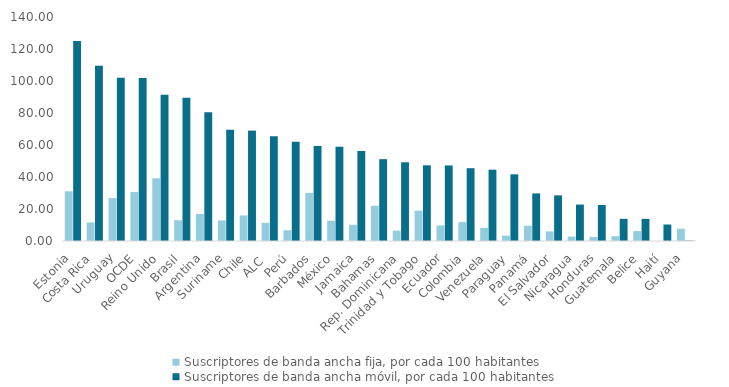
| Category | Suscriptores de banda ancha fija, por cada 100 habitantes | Suscriptores de banda ancha móvil, por cada 100 habitantes |
|---|---|---|
| Estonia | 31.068 | 125.026 |
| Costa Rica | 11.59 | 109.46 |
| Uruguay | 26.79 | 101.98 |
| OCDE | 30.6 | 101.8 |
| Reino Unido | 39.18 | 91.443 |
| Brasil | 12.97 | 89.51 |
| Argentina | 16.94 | 80.52 |
| Suriname | 12.88 | 69.58 |
| Chile | 15.97 | 69 |
| ALC  | 11.35 | 65.53 |
| Perú | 6.72 | 62.04 |
| Barbados | 30.08 | 59.32 |
| México | 12.67 | 58.84 |
| Jamaica | 10.12 | 56.22 |
| Bahamas | 21.99 | 51.16 |
| Rep. Dominicana | 6.47 | 49.2 |
| Trinidad y Tobago | 18.94 | 47.3 |
| Ecuador | 9.74 | 47.21 |
| Colombia | 11.8 | 45.5 |
| Venezuela | 8.23 | 44.56 |
| Paraguay | 3.35 | 41.69 |
| Panamá | 9.55 | 29.74 |
| El Salvador | 6.01 | 28.53 |
| Nicaragua | 2.79 | 22.76 |
| Honduras | 2.56 | 22.53 |
| Guatemala | 3.04 | 13.87 |
| Belice | 6.19 | 13.82 |
| Haití | 0.01 | 10.29 |
| Guyana | 7.64 | 0.25 |